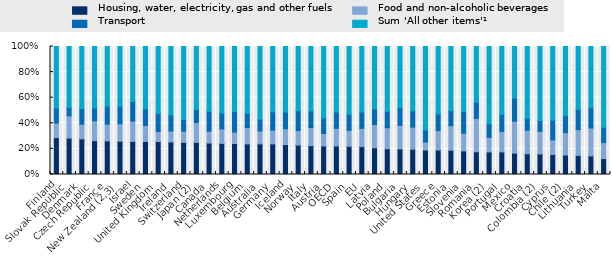
| Category | Housing, water, electricity, gas and other fuels | Food and non-alcoholic beverages | Transport | Sum 'All other items'¹ |
|---|---|---|---|---|
| Finland | 28.8 | 11.4 | 11.7 | 48.2 |
| Slovak Republic | 28.4 | 17.4 | 6.5 | 47.6 |
| Denmark | 27.9 | 11.5 | 12.1 | 48.6 |
| Czech Republic | 26.4 | 15.5 | 10 | 48 |
| France | 26.2 | 13.1 | 14.1 | 46.6 |
| New Zealand (2,3) | 26 | 13.5 | 13.7 | 46.6 |
| Israel | 25.8 | 15.9 | 15.3 | 42.9 |
| Sweden | 25.8 | 12.5 | 12.9 | 48.7 |
| United Kingdom | 25.7 | 7.9 | 13.8 | 52.4 |
| Ireland | 25.4 | 8.6 | 12.5 | 53.6 |
| Switzerland | 25.1 | 8.7 | 9.3 | 56.9 |
| Japan (2) | 25.1 | 15.5 | 10.3 | 49.2 |
| Canada | 24.3 | 9.2 | 15.3 | 50.2 |
| Netherlands | 24.3 | 11.3 | 12.4 | 52 |
| Luxembourg | 24.2 | 8.9 | 16 | 50.8 |
| Belgium | 23.9 | 12.7 | 11.2 | 52.1 |
| Australia | 23.9 | 10.1 | 9.1 | 56.9 |
| Germany  | 23.9 | 10.8 | 14.1 | 51.1 |
| Iceland | 23.4 | 12.4 | 13 | 51.3 |
| Norway | 23 | 11.4 | 15.5 | 50.2 |
| Italy | 22.5 | 14.2 | 12.9 | 50.3 |
| Austria | 22.3 | 9.7 | 12.1 | 55.9 |
| OECD | 22.246 | 13.803 | 12.708 | 51.2 |
| Spain | 22 | 12.5 | 12.4 | 53.1 |
| EU | 21.761 | 14.325 | 12.7 | 51.171 |
| Latvia | 20.9 | 18.2 | 12.1 | 48.8 |
| Poland | 20.1 | 16.4 | 12.8 | 50.7 |
| Bulgaria | 20 | 18.4 | 13.7 | 47.9 |
| Hungary | 19.7 | 17.3 | 12.7 | 50.2 |
| United States | 19.1 | 6.2 | 9.4 | 65.3 |
| Greece | 19.1 | 15.2 | 12.9 | 52.7 |
| Estonia | 18.9 | 19.3 | 11.7 | 50.2 |
| Slovenia | 18.5 | 13.8 | 17 | 50.8 |
| Romania | 17.7 | 26 | 12.5 | 43.4 |
| Korea (2) | 17.6 | 11.4 | 10.6 | 60.4 |
| Portugal | 17.6 | 16.1 | 13.3 | 53 |
| Mexico | 16.7 | 24.9 | 18.1 | 40.3 |
| Croatia | 16.2 | 18.3 | 9.4 | 56.1 |
| Colombia (2) | 16 | 17.7 | 8.4 | 57.8 |
| Cyprus | 15.6 | 11.4 | 15.3 | 57.6 |
| Chile (2) | 15.2 | 17.5 | 13.3 | 54.2 |
| Lithuania | 14.9 | 20.2 | 15.8 | 49.1 |
| Turkey | 14.5 | 21.8 | 15.9 | 47.7 |
| Malta | 12.4 | 12.5 | 11.7 | 63.3 |